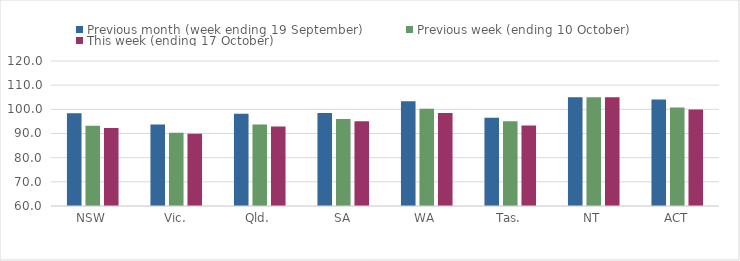
| Category | Previous month (week ending 19 September) | Previous week (ending 10 October) | This week (ending 17 October) |
|---|---|---|---|
| NSW | 98.41 | 93.18 | 92.31 |
| Vic. | 93.72 | 90.31 | 89.86 |
| Qld. | 98.14 | 93.74 | 92.9 |
| SA | 98.49 | 96 | 95.1 |
| WA | 103.33 | 100.19 | 98.46 |
| Tas. | 96.51 | 95.05 | 93.34 |
| NT | 104.99 | 104.99 | 104.99 |
| ACT | 104.08 | 100.79 | 99.94 |